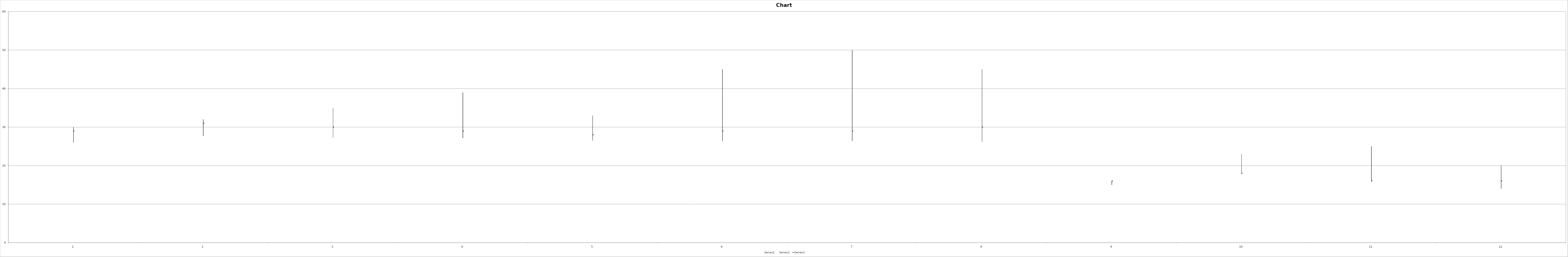
| Category | Series 0 | Series 1 | Series 2 |
|---|---|---|---|
| 0 | 30 | 26 | 29 |
| 1 | 32 | 27.7 | 31 |
| 2 | 35 | 27.29 | 30 |
| 3 | 39 | 27.15 | 29 |
| 4 | 33 | 26.53 | 28 |
| 5 | 45 | 26.38 | 29 |
| 6 | 50 | 26.4 | 29 |
| 7 | 45 | 26.24 | 30 |
| 8 | 16 | 15 | 16 |
| 9 | 23 | 18 | 18 |
| 10 | 25 | 16 | 16 |
| 11 | 20 | 14 | 16 |